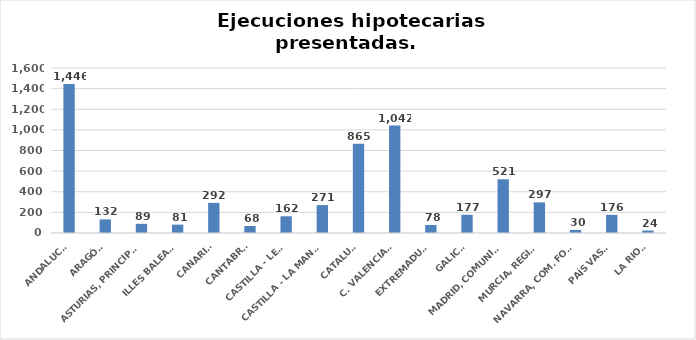
| Category | Series 0 |
|---|---|
| ANDALUCÍA | 1446 |
| ARAGÓN | 132 |
| ASTURIAS, PRINCIPADO | 89 |
| ILLES BALEARS | 81 |
| CANARIAS | 292 |
| CANTABRIA | 68 |
| CASTILLA - LEÓN | 162 |
| CASTILLA - LA MANCHA | 271 |
| CATALUÑA | 865 |
| C. VALENCIANA | 1042 |
| EXTREMADURA | 78 |
| GALICIA | 177 |
| MADRID, COMUNIDAD | 521 |
| MURCIA, REGIÓN | 297 |
| NAVARRA, COM. FORAL | 30 |
| PAÍS VASCO | 176 |
| LA RIOJA | 24 |